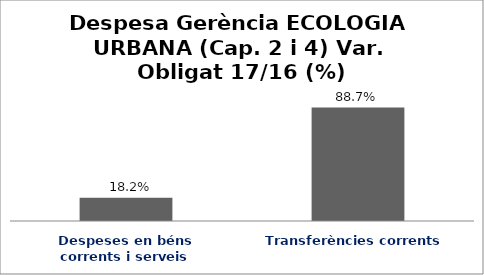
| Category | Series 0 |
|---|---|
| Despeses en béns corrents i serveis | 0.182 |
| Transferències corrents | 0.887 |